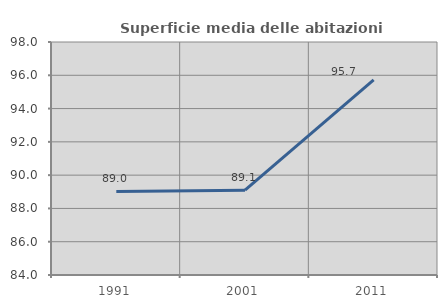
| Category | Superficie media delle abitazioni occupate |
|---|---|
| 1991.0 | 89.021 |
| 2001.0 | 89.094 |
| 2011.0 | 95.727 |